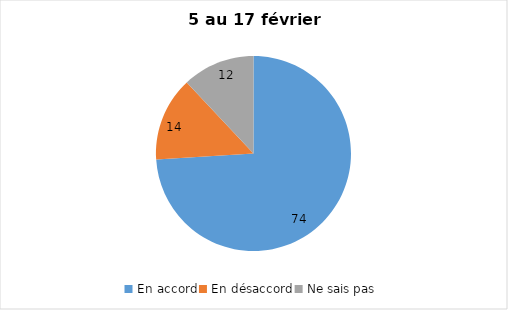
| Category | Series 0 |
|---|---|
| En accord | 74 |
| En désaccord | 14 |
| Ne sais pas | 12 |